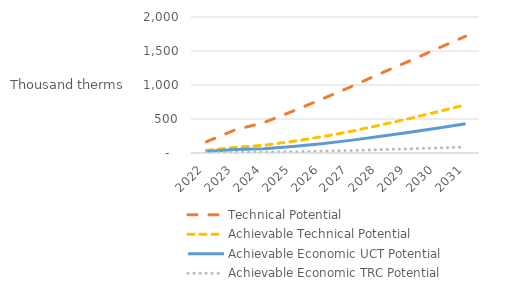
| Category | Technical Potential | Achievable Technical Potential | Achievable Economic UCT Potential | Achievable Economic TRC Potential |
|---|---|---|---|---|
| 2022.0 | 164.877 | 38.361 | 23.182 | 4.503 |
| 2023.0 | 339.993 | 83.294 | 50.852 | 9.684 |
| 2024.0 | 447.688 | 114.235 | 61.837 | 12.032 |
| 2025.0 | 615.444 | 170.658 | 95.813 | 18.68 |
| 2026.0 | 790.086 | 238.223 | 137.182 | 26.886 |
| 2027.0 | 971.089 | 316.484 | 185.612 | 36.679 |
| 2028.0 | 1161.84 | 406.542 | 241.525 | 48.175 |
| 2029.0 | 1343.393 | 500.931 | 300.121 | 60.568 |
| 2030.0 | 1531.762 | 603.604 | 363.805 | 74.198 |
| 2031.0 | 1717.122 | 709.448 | 429.323 | 88.388 |